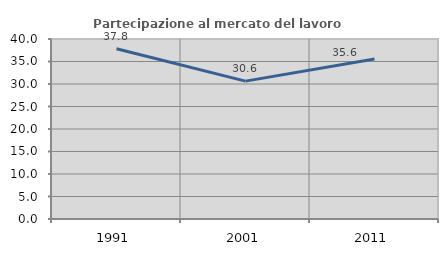
| Category | Partecipazione al mercato del lavoro  femminile |
|---|---|
| 1991.0 | 37.819 |
| 2001.0 | 30.638 |
| 2011.0 | 35.551 |